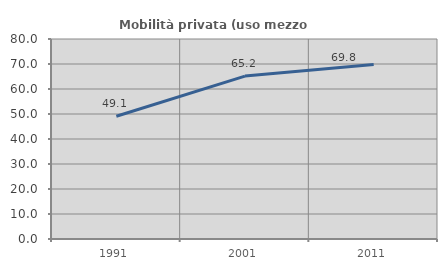
| Category | Mobilità privata (uso mezzo privato) |
|---|---|
| 1991.0 | 49.08 |
| 2001.0 | 65.161 |
| 2011.0 | 69.767 |